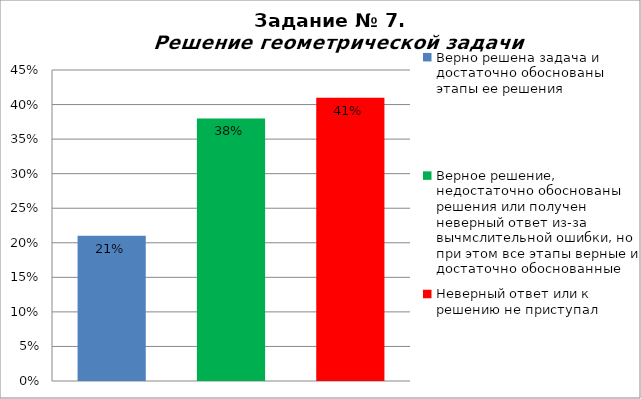
| Category | Решение геометрической задачи  |
|---|---|
| Верно решена задача и достаточно обоснованы этапы ее решения | 0.21 |
| Верное решение, недостаточно обоснованы решения или получен неверный ответ из-за вычмслительной ошибки, но при этом все этапы верные и достаточно обоснованные | 0.38 |
| Неверный ответ или к решению не приступал | 0.41 |